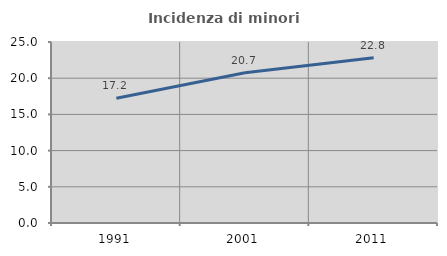
| Category | Incidenza di minori stranieri |
|---|---|
| 1991.0 | 17.241 |
| 2001.0 | 20.741 |
| 2011.0 | 22.831 |